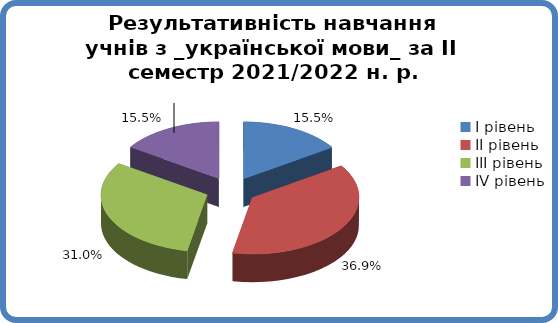
| Category | Series 0 |
|---|---|
| 0 | 0.155 |
| 1 | 0.369 |
| 2 | 0.31 |
| 3 | 0.155 |